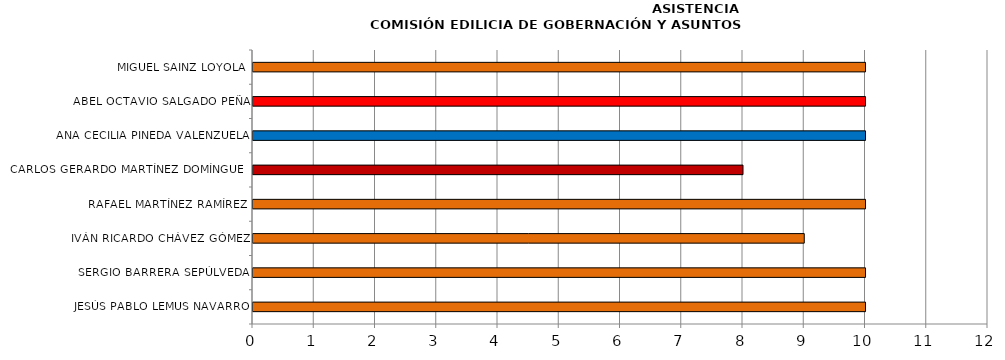
| Category | Series 0 |
|---|---|
| JESÚS PABLO LEMUS NAVARRO | 10 |
| SERGIO BARRERA SEPÚLVEDA | 10 |
| IVÁN RICARDO CHÁVEZ GÓMEZ | 9 |
| RAFAEL MARTÍNEZ RAMÍREZ | 10 |
| CARLOS GERARDO MARTÍNEZ DOMÍNGUEZ | 8 |
| ANA CECILIA PINEDA VALENZUELA | 10 |
| ABEL OCTAVIO SALGADO PEÑA | 10 |
| MIGUEL SAINZ LOYOLA | 10 |